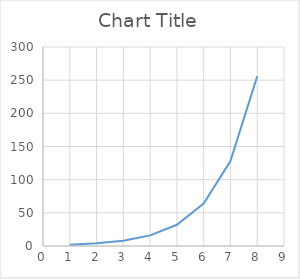
| Category | Series 0 |
|---|---|
| 1.0 | 2 |
| 2.0 | 4 |
| 3.0 | 8 |
| 4.0 | 16 |
| 5.0 | 32 |
| 6.0 | 64 |
| 7.0 | 128 |
| 8.0 | 256 |